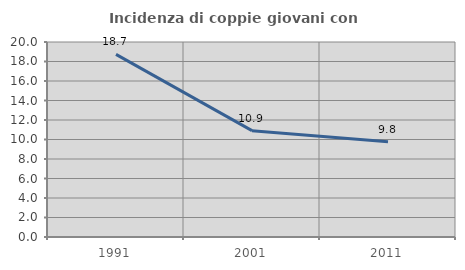
| Category | Incidenza di coppie giovani con figli |
|---|---|
| 1991.0 | 18.727 |
| 2001.0 | 10.909 |
| 2011.0 | 9.781 |